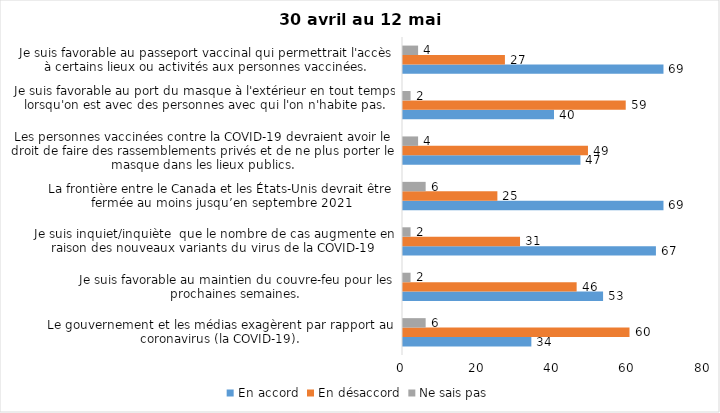
| Category | En accord | En désaccord | Ne sais pas |
|---|---|---|---|
| Le gouvernement et les médias exagèrent par rapport au coronavirus (la COVID-19). | 34 | 60 | 6 |
| Je suis favorable au maintien du couvre-feu pour les prochaines semaines. | 53 | 46 | 2 |
| Je suis inquiet/inquiète  que le nombre de cas augmente en raison des nouveaux variants du virus de la COVID-19 | 67 | 31 | 2 |
| La frontière entre le Canada et les États-Unis devrait être fermée au moins jusqu’en septembre 2021 | 69 | 25 | 6 |
| Les personnes vaccinées contre la COVID-19 devraient avoir le droit de faire des rassemblements privés et de ne plus porter le masque dans les lieux publics. | 47 | 49 | 4 |
| Je suis favorable au port du masque à l'extérieur en tout temps lorsqu'on est avec des personnes avec qui l'on n'habite pas. | 40 | 59 | 2 |
| Je suis favorable au passeport vaccinal qui permettrait l'accès à certains lieux ou activités aux personnes vaccinées. | 69 | 27 | 4 |